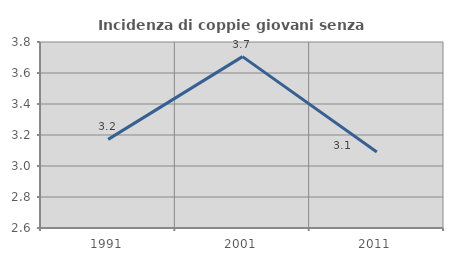
| Category | Incidenza di coppie giovani senza figli |
|---|---|
| 1991.0 | 3.172 |
| 2001.0 | 3.706 |
| 2011.0 | 3.09 |